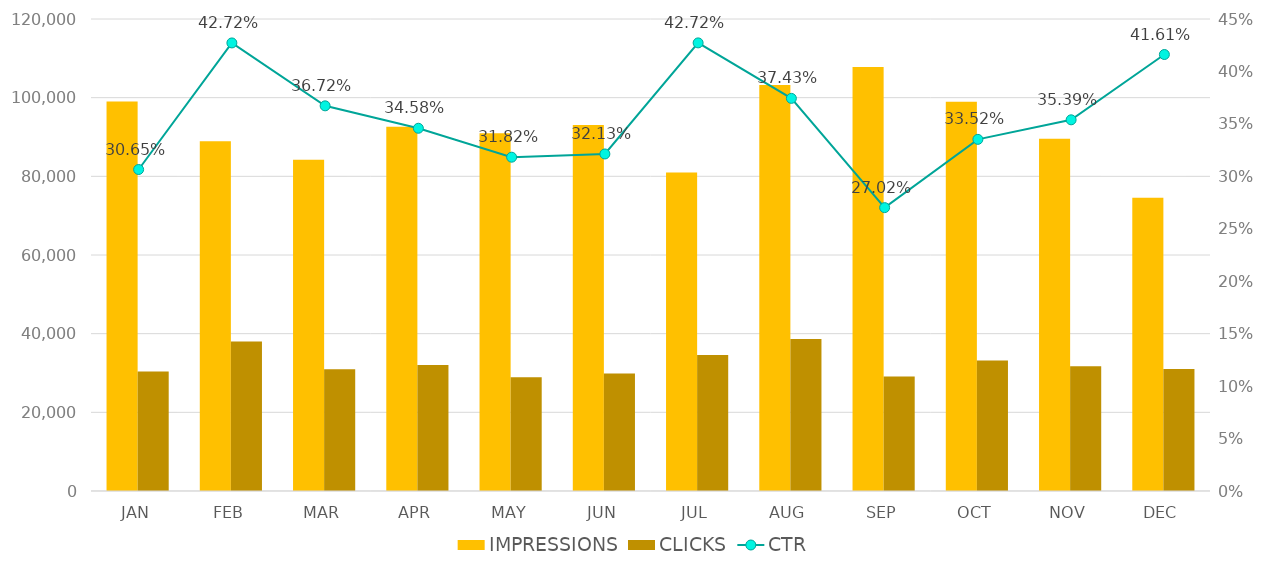
| Category | IMPRESSIONS | CLICKS |
|---|---|---|
| JAN | 99034 | 30355 |
| FEB | 88946 | 37996 |
| MAR | 84242 | 30935 |
| APR | 92606 | 32026 |
| MAY | 90960 | 28947 |
| JUN | 93024 | 29891 |
| JUL | 80976 | 34595 |
| AUG | 103215 | 38636 |
| SEP | 107809 | 29126 |
| OCT | 98935 | 33167 |
| NOV | 89550 | 31690 |
| DEC | 74548 | 31023 |